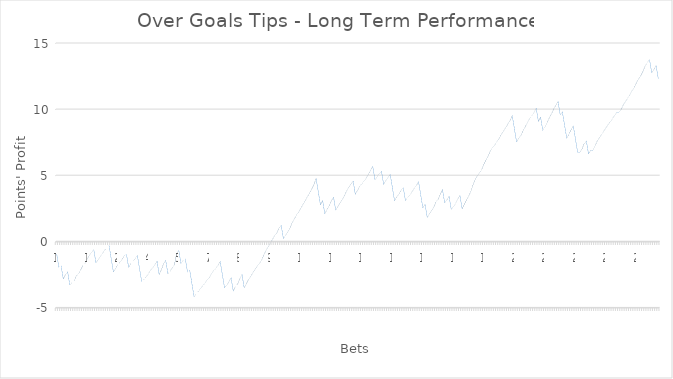
| Category | Balance |
|---|---|
| 0 | -1 |
| 1 | -2 |
| 2 | -1.87 |
| 3 | -2.87 |
| 4 | -2.54 |
| 5 | -2.33 |
| 6 | -3.33 |
| 7 | -3.13 |
| 8 | -3 |
| 9 | -2.64 |
| 10 | -2.48 |
| 11 | -2.18 |
| 12 | -1.85 |
| 13 | -1.7 |
| 14 | -1.37 |
| 15 | -1.08 |
| 16 | -0.86 |
| 17 | -0.66 |
| 18 | -1.66 |
| 19 | -1.41 |
| 20 | -1.19 |
| 21 | -0.94 |
| 22 | -0.69 |
| 23 | -0.51 |
| 24 | -0.34 |
| 25 | -1.34 |
| 26 | -2.34 |
| 27 | -2.09 |
| 28 | -1.79 |
| 29 | -1.61 |
| 30 | -1.39 |
| 31 | -1.11 |
| 32 | -1.01 |
| 33 | -2.01 |
| 34 | -1.71 |
| 35 | -1.54 |
| 36 | -1.33 |
| 37 | -1.1 |
| 38 | -2.1 |
| 39 | -3.1 |
| 40 | -2.92 |
| 41 | -2.73 |
| 42 | -2.49 |
| 43 | -2.23 |
| 44 | -2.02 |
| 45 | -1.81 |
| 46 | -1.53 |
| 47 | -2.53 |
| 48 | -2.17 |
| 49 | -1.73 |
| 50 | -1.47 |
| 51 | -2.47 |
| 52 | -2.29 |
| 53 | -2.03 |
| 54 | -1.83 |
| 55 | -0.95 |
| 56 | -0.71 |
| 57 | -1.71 |
| 58 | -1.48 |
| 59 | -1.35 |
| 60 | -2.35 |
| 61 | -2.2 |
| 62 | -3.2 |
| 63 | -4.2 |
| 64 | -3.98 |
| 65 | -3.81 |
| 66 | -3.61 |
| 67 | -3.38 |
| 68 | -3.19 |
| 69 | -2.97 |
| 70 | -2.77 |
| 71 | -2.48 |
| 72 | -2.26 |
| 73 | -2.06 |
| 74 | -1.84 |
| 75 | -1.55 |
| 76 | -2.55 |
| 77 | -3.55 |
| 78 | -3.35 |
| 79 | -3.08 |
| 80 | -2.79 |
| 81 | -3.79 |
| 82 | -3.44 |
| 83 | -3.26 |
| 84 | -2.86 |
| 85 | -2.53 |
| 86 | -3.53 |
| 87 | -3.24 |
| 88 | -2.91 |
| 89 | -2.69 |
| 90 | -2.4 |
| 91 | -2.15 |
| 92 | -1.9 |
| 93 | -1.7 |
| 94 | -1.45 |
| 95 | -1.07 |
| 96 | -0.71 |
| 97 | -0.45 |
| 98 | -0.17 |
| 99 | 0.12 |
| 100 | 0.42 |
| 101 | 0.62 |
| 102 | 0.98 |
| 103 | 1.18 |
| 104 | 0.18 |
| 105 | 0.43 |
| 106 | 0.68 |
| 107 | 0.97 |
| 108 | 1.37 |
| 109 | 1.66 |
| 110 | 1.96 |
| 111 | 2.18 |
| 112 | 2.47 |
| 113 | 2.76 |
| 114 | 3.04 |
| 115 | 3.34 |
| 116 | 3.63 |
| 117 | 3.93 |
| 118 | 4.26 |
| 119 | 4.73 |
| 120 | 3.73 |
| 121 | 2.73 |
| 122 | 3.06 |
| 123 | 2.06 |
| 124 | 2.37 |
| 125 | 2.67 |
| 126 | 3.03 |
| 127 | 3.33 |
| 128 | 2.33 |
| 129 | 2.59 |
| 130 | 2.88 |
| 131 | 3.13 |
| 132 | 3.43 |
| 133 | 3.79 |
| 134 | 4.06 |
| 135 | 4.31 |
| 136 | 4.53 |
| 137 | 3.53 |
| 138 | 3.83 |
| 139 | 4.13 |
| 140 | 4.33 |
| 141 | 4.53 |
| 142 | 4.75 |
| 143 | 5.05 |
| 144 | 5.34 |
| 145 | 5.64 |
| 146 | 4.64 |
| 147 | 4.86 |
| 148 | 5.06 |
| 149 | 5.28 |
| 150 | 4.28 |
| 151 | 4.57 |
| 152 | 4.79 |
| 153 | 5.04 |
| 154 | 4.04 |
| 155 | 3.04 |
| 156 | 3.34 |
| 157 | 3.55 |
| 158 | 3.84 |
| 159 | 4.04 |
| 160 | 3.04 |
| 161 | 3.29 |
| 162 | 3.47 |
| 163 | 3.72 |
| 164 | 3.98 |
| 165 | 4.18 |
| 166 | 4.49 |
| 167 | 3.49 |
| 168 | 2.49 |
| 169 | 2.78 |
| 170 | 1.78 |
| 171 | 2.05 |
| 172 | 2.3 |
| 173 | 2.55 |
| 174 | 2.95 |
| 175 | 3.15 |
| 176 | 3.55 |
| 177 | 3.88 |
| 178 | 2.88 |
| 179 | 3.1 |
| 180 | 3.4 |
| 181 | 2.4 |
| 182 | 2.62 |
| 183 | 2.84 |
| 184 | 3.17 |
| 185 | 3.44 |
| 186 | 2.44 |
| 187 | 2.77 |
| 188 | 3.1 |
| 189 | 3.39 |
| 190 | 3.75 |
| 191 | 4.25 |
| 192 | 4.65 |
| 193 | 4.94 |
| 194 | 5.16 |
| 195 | 5.41 |
| 196 | 5.81 |
| 197 | 6.14 |
| 198 | 6.44 |
| 199 | 6.84 |
| 200 | 7.04 |
| 201 | 7.26 |
| 202 | 7.51 |
| 203 | 7.76 |
| 204 | 8.06 |
| 205 | 8.32 |
| 206 | 8.57 |
| 207 | 8.85 |
| 208 | 9.12 |
| 209 | 9.48 |
| 210 | 8.48 |
| 211 | 7.48 |
| 212 | 7.77 |
| 213 | 7.99 |
| 214 | 8.35 |
| 215 | 8.65 |
| 216 | 8.97 |
| 217 | 9.26 |
| 218 | 9.46 |
| 219 | 9.71 |
| 220 | 10.04 |
| 221 | 9.04 |
| 222 | 9.37 |
| 223 | 8.37 |
| 224 | 8.62 |
| 225 | 8.95 |
| 226 | 9.31 |
| 227 | 9.61 |
| 228 | 9.97 |
| 229 | 10.27 |
| 230 | 10.56 |
| 231 | 9.56 |
| 232 | 9.77 |
| 233 | 8.77 |
| 234 | 7.77 |
| 235 | 8.07 |
| 236 | 8.41 |
| 237 | 8.71 |
| 238 | 7.71 |
| 239 | 6.71 |
| 240 | 6.71 |
| 241 | 6.96 |
| 242 | 7.36 |
| 243 | 7.58 |
| 244 | 6.58 |
| 245 | 6.87 |
| 246 | 6.87 |
| 247 | 7.2 |
| 248 | 7.56 |
| 249 | 7.81 |
| 250 | 8.06 |
| 251 | 8.31 |
| 252 | 8.56 |
| 253 | 8.81 |
| 254 | 9.04 |
| 255 | 9.26 |
| 256 | 9.51 |
| 257 | 9.73 |
| 258 | 9.73 |
| 259 | 9.95 |
| 260 | 10.31 |
| 261 | 10.56 |
| 262 | 10.81 |
| 263 | 11.06 |
| 264 | 11.39 |
| 265 | 11.61 |
| 266 | 11.97 |
| 267 | 12.26 |
| 268 | 12.51 |
| 269 | 12.84 |
| 270 | 13.24 |
| 271 | 13.49 |
| 272 | 13.71 |
| 273 | 12.71 |
| 274 | 12.98 |
| 275 | 13.28 |
| 276 | 12.28 |